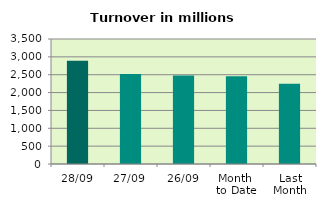
| Category | Series 0 |
|---|---|
| 28/09 | 2891.844 |
| 27/09 | 2521.439 |
| 26/09 | 2476.921 |
| Month 
to Date | 2456.575 |
| Last
Month | 2249.305 |